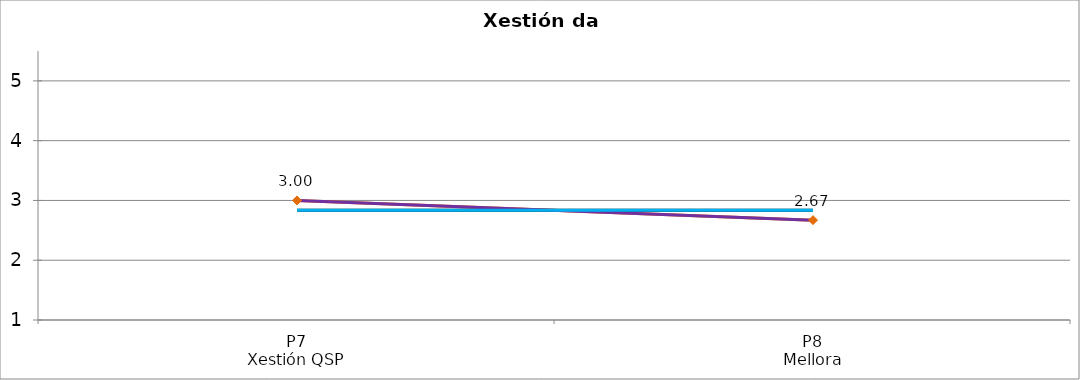
| Category | Valoración (1-5) | MEDIA |
|---|---|---|
| P7
Xestión QSP | 3 | 2.835 |
| P8
Mellora | 2.67 | 2.835 |